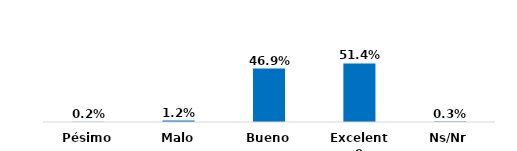
| Category | Series 0 |
|---|---|
| Pésimo | 0.002 |
| Malo | 0.012 |
| Bueno | 0.469 |
| Excelente | 0.514 |
| Ns/Nr | 0.003 |